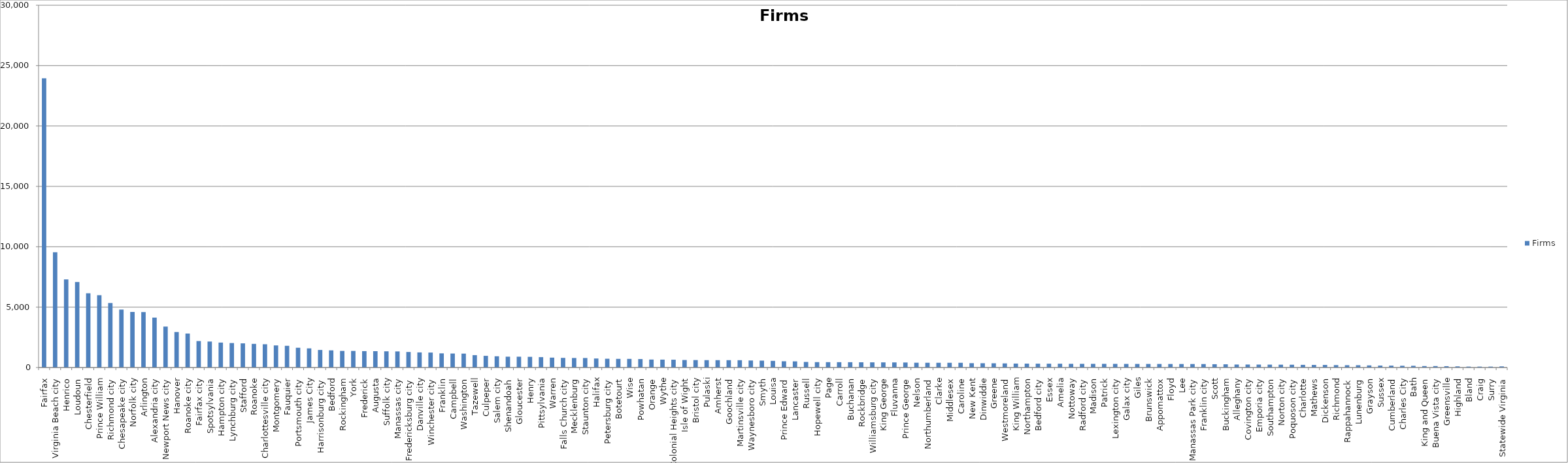
| Category | Firms |
|---|---|
| Fairfax | 23944 |
| Virginia Beach city | 9542 |
| Henrico | 7301 |
| Loudoun | 7081 |
| Chesterfield | 6149 |
| Prince William | 5989 |
| Richmond city | 5341 |
| Chesapeake city | 4799 |
| Norfolk city | 4603 |
| Arlington | 4592 |
| Alexandria city | 4133 |
| Newport News city | 3390 |
| Hanover | 2941 |
| Roanoke city | 2814 |
| Fairfax city | 2191 |
| Spotsylvania | 2151 |
| Hampton city | 2067 |
| Lynchburg city | 2027 |
| Stafford | 2001 |
| Roanoke | 1959 |
| Charlottesville city | 1929 |
| Montgomery | 1830 |
| Fauquier | 1799 |
| Portsmouth city | 1638 |
| James City | 1587 |
| Harrisonburg city | 1454 |
| Bedford | 1422 |
| Rockingham | 1376 |
| York | 1375 |
| Frederick | 1358 |
| Augusta | 1354 |
| Suffolk city | 1343 |
| Manassas city | 1334 |
| Fredericksburg city | 1286 |
| Danville city | 1251 |
| Winchester city | 1239 |
| Franklin | 1174 |
| Campbell | 1160 |
| Washington | 1153 |
| Tazewell | 1025 |
| Culpeper | 968 |
| Salem city | 931 |
| Shenandoah | 897 |
| Gloucester | 896 |
| Henry | 885 |
| Pittsylvania | 861 |
| Warren | 820 |
| Falls Church city | 799 |
| Mecklenburg | 790 |
| Staunton city | 788 |
| Halifax | 747 |
| Petersburg city | 727 |
| Botetourt | 717 |
| Wise | 715 |
| Powhatan | 701 |
| Orange | 661 |
| Wythe | 655 |
| Colonial Heights city | 648 |
| Isle of Wight | 622 |
| Bristol city | 617 |
| Pulaski | 611 |
| Amherst | 610 |
| Goochland | 609 |
| Martinsville city | 606 |
| Waynesboro city | 581 |
| Smyth | 571 |
| Louisa | 552 |
| Prince Edward | 519 |
| Lancaster | 511 |
| Russell | 462 |
| Hopewell city | 447 |
| Page | 444 |
| Carroll | 442 |
| Buchanan | 440 |
| Rockbridge | 434 |
| Williamsburg city | 429 |
| King George | 426 |
| Fluvanna | 424 |
| Prince George | 416 |
| Nelson | 397 |
| Northumberland | 394 |
| Clarke | 393 |
| Middlesex | 393 |
| Caroline | 392 |
| New Kent | 361 |
| Dinwiddie | 357 |
| Greene | 353 |
| Westmoreland | 342 |
| King William | 328 |
| Northampton | 323 |
| Bedford city | 319 |
| Essex | 318 |
| Amelia | 317 |
| Nottoway | 307 |
| Radford city | 306 |
| Madison | 305 |
| Patrick | 305 |
| Lexington city | 303 |
| Galax city | 298 |
| Giles | 297 |
| Brunswick | 296 |
| Appomattox | 295 |
| Floyd | 292 |
| Lee | 291 |
| Manassas Park city | 290 |
| Franklin city | 287 |
| Scott | 274 |
| Buckingham | 267 |
| Alleghany | 247 |
| Covington city | 247 |
| Emporia city | 243 |
| Southampton | 239 |
| Norton city | 235 |
| Poquoson city | 231 |
| Charlotte | 221 |
| Mathews | 215 |
| Dickenson | 214 |
| Richmond | 201 |
| Rappahannock | 193 |
| Lunenburg | 192 |
| Grayson | 176 |
| Sussex | 163 |
| Cumberland | 158 |
| Charles City | 147 |
| Bath | 145 |
| King and Queen | 121 |
| Buena Vista city | 121 |
| Greensville | 112 |
| Highland | 97 |
| Bland | 77 |
| Craig | 76 |
| Surry | 76 |
| Statewide Virginia | 95 |